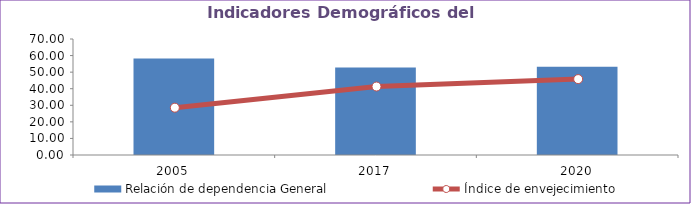
| Category | Relación de dependencia General |
|---|---|
| 2005.0 | 58.261 |
| 2017.0 | 52.86 |
| 2020.0 | 53.322 |